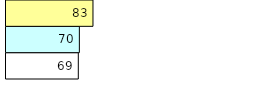
| Category | Total Standouts | Total Recd | Total Tipsters |
|---|---|---|---|
| 0 | 69 | 70 | 83 |